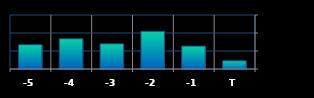
| Category | Series 0 |
|---|---|
| T | 91424 |
| -1 | 254819 |
| -2 | 419220 |
| -3 | 279971 |
| -4 | 336532 |
| -5 | 269851 |